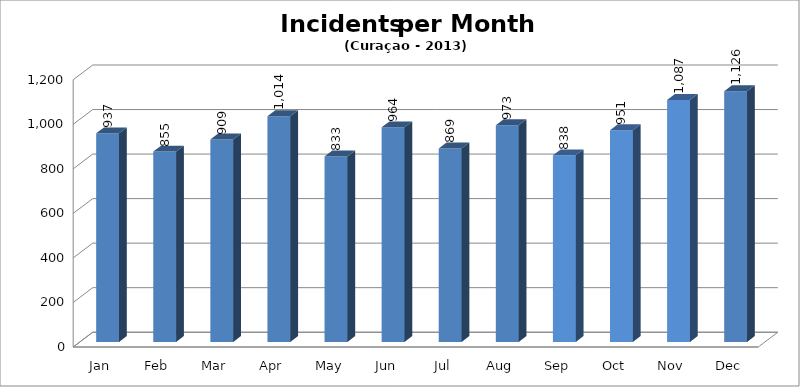
| Category | Series 0 |
|---|---|
| Jan | 937 |
| Feb | 855 |
| Mar | 909 |
| Apr | 1014 |
| May | 833 |
| Jun | 964 |
| Jul | 869 |
| Aug | 973 |
| Sep | 838 |
| Oct | 951 |
| Nov | 1087 |
| Dec | 1126 |